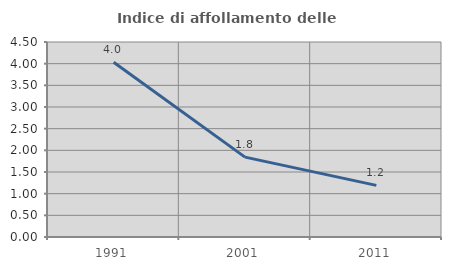
| Category | Indice di affollamento delle abitazioni  |
|---|---|
| 1991.0 | 4.033 |
| 2001.0 | 1.843 |
| 2011.0 | 1.192 |